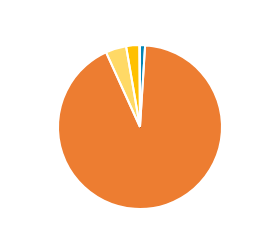
| Category | Series 0 |
|---|---|
| PC/MC | 59 |
| CAR/LGV | 5456 |
| OGV1 & PSV 2Axle | 241 |
| OGV1 & PSV 3 Axle | 154 |
| OGV2 | 7 |